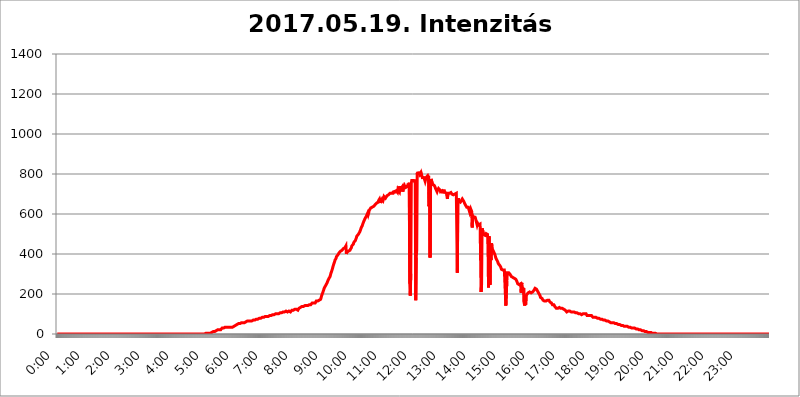
| Category | 2017.05.19. Intenzitás [W/m^2] |
|---|---|
| 0.0 | 0 |
| 0.0006944444444444445 | 0 |
| 0.001388888888888889 | 0 |
| 0.0020833333333333333 | 0 |
| 0.002777777777777778 | 0 |
| 0.003472222222222222 | 0 |
| 0.004166666666666667 | 0 |
| 0.004861111111111111 | 0 |
| 0.005555555555555556 | 0 |
| 0.0062499999999999995 | 0 |
| 0.006944444444444444 | 0 |
| 0.007638888888888889 | 0 |
| 0.008333333333333333 | 0 |
| 0.009027777777777779 | 0 |
| 0.009722222222222222 | 0 |
| 0.010416666666666666 | 0 |
| 0.011111111111111112 | 0 |
| 0.011805555555555555 | 0 |
| 0.012499999999999999 | 0 |
| 0.013194444444444444 | 0 |
| 0.013888888888888888 | 0 |
| 0.014583333333333332 | 0 |
| 0.015277777777777777 | 0 |
| 0.015972222222222224 | 0 |
| 0.016666666666666666 | 0 |
| 0.017361111111111112 | 0 |
| 0.018055555555555557 | 0 |
| 0.01875 | 0 |
| 0.019444444444444445 | 0 |
| 0.02013888888888889 | 0 |
| 0.020833333333333332 | 0 |
| 0.02152777777777778 | 0 |
| 0.022222222222222223 | 0 |
| 0.02291666666666667 | 0 |
| 0.02361111111111111 | 0 |
| 0.024305555555555556 | 0 |
| 0.024999999999999998 | 0 |
| 0.025694444444444447 | 0 |
| 0.02638888888888889 | 0 |
| 0.027083333333333334 | 0 |
| 0.027777777777777776 | 0 |
| 0.02847222222222222 | 0 |
| 0.029166666666666664 | 0 |
| 0.029861111111111113 | 0 |
| 0.030555555555555555 | 0 |
| 0.03125 | 0 |
| 0.03194444444444445 | 0 |
| 0.03263888888888889 | 0 |
| 0.03333333333333333 | 0 |
| 0.034027777777777775 | 0 |
| 0.034722222222222224 | 0 |
| 0.035416666666666666 | 0 |
| 0.036111111111111115 | 0 |
| 0.03680555555555556 | 0 |
| 0.0375 | 0 |
| 0.03819444444444444 | 0 |
| 0.03888888888888889 | 0 |
| 0.03958333333333333 | 0 |
| 0.04027777777777778 | 0 |
| 0.04097222222222222 | 0 |
| 0.041666666666666664 | 0 |
| 0.042361111111111106 | 0 |
| 0.04305555555555556 | 0 |
| 0.043750000000000004 | 0 |
| 0.044444444444444446 | 0 |
| 0.04513888888888889 | 0 |
| 0.04583333333333334 | 0 |
| 0.04652777777777778 | 0 |
| 0.04722222222222222 | 0 |
| 0.04791666666666666 | 0 |
| 0.04861111111111111 | 0 |
| 0.049305555555555554 | 0 |
| 0.049999999999999996 | 0 |
| 0.05069444444444445 | 0 |
| 0.051388888888888894 | 0 |
| 0.052083333333333336 | 0 |
| 0.05277777777777778 | 0 |
| 0.05347222222222222 | 0 |
| 0.05416666666666667 | 0 |
| 0.05486111111111111 | 0 |
| 0.05555555555555555 | 0 |
| 0.05625 | 0 |
| 0.05694444444444444 | 0 |
| 0.057638888888888885 | 0 |
| 0.05833333333333333 | 0 |
| 0.05902777777777778 | 0 |
| 0.059722222222222225 | 0 |
| 0.06041666666666667 | 0 |
| 0.061111111111111116 | 0 |
| 0.06180555555555556 | 0 |
| 0.0625 | 0 |
| 0.06319444444444444 | 0 |
| 0.06388888888888888 | 0 |
| 0.06458333333333334 | 0 |
| 0.06527777777777778 | 0 |
| 0.06597222222222222 | 0 |
| 0.06666666666666667 | 0 |
| 0.06736111111111111 | 0 |
| 0.06805555555555555 | 0 |
| 0.06874999999999999 | 0 |
| 0.06944444444444443 | 0 |
| 0.07013888888888889 | 0 |
| 0.07083333333333333 | 0 |
| 0.07152777777777779 | 0 |
| 0.07222222222222223 | 0 |
| 0.07291666666666667 | 0 |
| 0.07361111111111111 | 0 |
| 0.07430555555555556 | 0 |
| 0.075 | 0 |
| 0.07569444444444444 | 0 |
| 0.0763888888888889 | 0 |
| 0.07708333333333334 | 0 |
| 0.07777777777777778 | 0 |
| 0.07847222222222222 | 0 |
| 0.07916666666666666 | 0 |
| 0.0798611111111111 | 0 |
| 0.08055555555555556 | 0 |
| 0.08125 | 0 |
| 0.08194444444444444 | 0 |
| 0.08263888888888889 | 0 |
| 0.08333333333333333 | 0 |
| 0.08402777777777777 | 0 |
| 0.08472222222222221 | 0 |
| 0.08541666666666665 | 0 |
| 0.08611111111111112 | 0 |
| 0.08680555555555557 | 0 |
| 0.08750000000000001 | 0 |
| 0.08819444444444445 | 0 |
| 0.08888888888888889 | 0 |
| 0.08958333333333333 | 0 |
| 0.09027777777777778 | 0 |
| 0.09097222222222222 | 0 |
| 0.09166666666666667 | 0 |
| 0.09236111111111112 | 0 |
| 0.09305555555555556 | 0 |
| 0.09375 | 0 |
| 0.09444444444444444 | 0 |
| 0.09513888888888888 | 0 |
| 0.09583333333333333 | 0 |
| 0.09652777777777777 | 0 |
| 0.09722222222222222 | 0 |
| 0.09791666666666667 | 0 |
| 0.09861111111111111 | 0 |
| 0.09930555555555555 | 0 |
| 0.09999999999999999 | 0 |
| 0.10069444444444443 | 0 |
| 0.1013888888888889 | 0 |
| 0.10208333333333335 | 0 |
| 0.10277777777777779 | 0 |
| 0.10347222222222223 | 0 |
| 0.10416666666666667 | 0 |
| 0.10486111111111111 | 0 |
| 0.10555555555555556 | 0 |
| 0.10625 | 0 |
| 0.10694444444444444 | 0 |
| 0.1076388888888889 | 0 |
| 0.10833333333333334 | 0 |
| 0.10902777777777778 | 0 |
| 0.10972222222222222 | 0 |
| 0.1111111111111111 | 0 |
| 0.11180555555555556 | 0 |
| 0.11180555555555556 | 0 |
| 0.1125 | 0 |
| 0.11319444444444444 | 0 |
| 0.11388888888888889 | 0 |
| 0.11458333333333333 | 0 |
| 0.11527777777777777 | 0 |
| 0.11597222222222221 | 0 |
| 0.11666666666666665 | 0 |
| 0.1173611111111111 | 0 |
| 0.11805555555555557 | 0 |
| 0.11944444444444445 | 0 |
| 0.12013888888888889 | 0 |
| 0.12083333333333333 | 0 |
| 0.12152777777777778 | 0 |
| 0.12222222222222223 | 0 |
| 0.12291666666666667 | 0 |
| 0.12291666666666667 | 0 |
| 0.12361111111111112 | 0 |
| 0.12430555555555556 | 0 |
| 0.125 | 0 |
| 0.12569444444444444 | 0 |
| 0.12638888888888888 | 0 |
| 0.12708333333333333 | 0 |
| 0.16875 | 0 |
| 0.12847222222222224 | 0 |
| 0.12916666666666668 | 0 |
| 0.12986111111111112 | 0 |
| 0.13055555555555556 | 0 |
| 0.13125 | 0 |
| 0.13194444444444445 | 0 |
| 0.1326388888888889 | 0 |
| 0.13333333333333333 | 0 |
| 0.13402777777777777 | 0 |
| 0.13402777777777777 | 0 |
| 0.13472222222222222 | 0 |
| 0.13541666666666666 | 0 |
| 0.1361111111111111 | 0 |
| 0.13749999999999998 | 0 |
| 0.13819444444444443 | 0 |
| 0.1388888888888889 | 0 |
| 0.13958333333333334 | 0 |
| 0.14027777777777778 | 0 |
| 0.14097222222222222 | 0 |
| 0.14166666666666666 | 0 |
| 0.1423611111111111 | 0 |
| 0.14305555555555557 | 0 |
| 0.14375000000000002 | 0 |
| 0.14444444444444446 | 0 |
| 0.1451388888888889 | 0 |
| 0.1451388888888889 | 0 |
| 0.14652777777777778 | 0 |
| 0.14722222222222223 | 0 |
| 0.14791666666666667 | 0 |
| 0.1486111111111111 | 0 |
| 0.14930555555555555 | 0 |
| 0.15 | 0 |
| 0.15069444444444444 | 0 |
| 0.15138888888888888 | 0 |
| 0.15208333333333332 | 0 |
| 0.15277777777777776 | 0 |
| 0.15347222222222223 | 0 |
| 0.15416666666666667 | 0 |
| 0.15486111111111112 | 0 |
| 0.15555555555555556 | 0 |
| 0.15625 | 0 |
| 0.15694444444444444 | 0 |
| 0.15763888888888888 | 0 |
| 0.15833333333333333 | 0 |
| 0.15902777777777777 | 0 |
| 0.15972222222222224 | 0 |
| 0.16041666666666668 | 0 |
| 0.16111111111111112 | 0 |
| 0.16180555555555556 | 0 |
| 0.1625 | 0 |
| 0.16319444444444445 | 0 |
| 0.1638888888888889 | 0 |
| 0.16458333333333333 | 0 |
| 0.16527777777777777 | 0 |
| 0.16597222222222222 | 0 |
| 0.16666666666666666 | 0 |
| 0.1673611111111111 | 0 |
| 0.16805555555555554 | 0 |
| 0.16874999999999998 | 0 |
| 0.16944444444444443 | 0 |
| 0.17013888888888887 | 0 |
| 0.1708333333333333 | 0 |
| 0.17152777777777775 | 0 |
| 0.17222222222222225 | 0 |
| 0.1729166666666667 | 0 |
| 0.17361111111111113 | 0 |
| 0.17430555555555557 | 0 |
| 0.17500000000000002 | 0 |
| 0.17569444444444446 | 0 |
| 0.1763888888888889 | 0 |
| 0.17708333333333334 | 0 |
| 0.17777777777777778 | 0 |
| 0.17847222222222223 | 0 |
| 0.17916666666666667 | 0 |
| 0.1798611111111111 | 0 |
| 0.18055555555555555 | 0 |
| 0.18125 | 0 |
| 0.18194444444444444 | 0 |
| 0.1826388888888889 | 0 |
| 0.18333333333333335 | 0 |
| 0.1840277777777778 | 0 |
| 0.18472222222222223 | 0 |
| 0.18541666666666667 | 0 |
| 0.18611111111111112 | 0 |
| 0.18680555555555556 | 0 |
| 0.1875 | 0 |
| 0.18819444444444444 | 0 |
| 0.18888888888888888 | 0 |
| 0.18958333333333333 | 0 |
| 0.19027777777777777 | 0 |
| 0.1909722222222222 | 0 |
| 0.19166666666666665 | 0 |
| 0.19236111111111112 | 0 |
| 0.19305555555555554 | 0 |
| 0.19375 | 0 |
| 0.19444444444444445 | 0 |
| 0.1951388888888889 | 0 |
| 0.19583333333333333 | 0 |
| 0.19652777777777777 | 0 |
| 0.19722222222222222 | 0 |
| 0.19791666666666666 | 0 |
| 0.1986111111111111 | 0 |
| 0.19930555555555554 | 0 |
| 0.19999999999999998 | 0 |
| 0.20069444444444443 | 0 |
| 0.20138888888888887 | 0 |
| 0.2020833333333333 | 0 |
| 0.2027777777777778 | 0 |
| 0.2034722222222222 | 0 |
| 0.2041666666666667 | 0 |
| 0.20486111111111113 | 0 |
| 0.20555555555555557 | 0 |
| 0.20625000000000002 | 0 |
| 0.20694444444444446 | 0 |
| 0.2076388888888889 | 0 |
| 0.20833333333333334 | 3.525 |
| 0.20902777777777778 | 3.525 |
| 0.20972222222222223 | 3.525 |
| 0.21041666666666667 | 3.525 |
| 0.2111111111111111 | 3.525 |
| 0.21180555555555555 | 3.525 |
| 0.2125 | 3.525 |
| 0.21319444444444444 | 3.525 |
| 0.2138888888888889 | 3.525 |
| 0.21458333333333335 | 3.525 |
| 0.2152777777777778 | 7.887 |
| 0.21597222222222223 | 7.887 |
| 0.21666666666666667 | 7.887 |
| 0.21736111111111112 | 12.257 |
| 0.21805555555555556 | 12.257 |
| 0.21875 | 12.257 |
| 0.21944444444444444 | 12.257 |
| 0.22013888888888888 | 12.257 |
| 0.22083333333333333 | 12.257 |
| 0.22152777777777777 | 16.636 |
| 0.2222222222222222 | 16.636 |
| 0.22291666666666665 | 16.636 |
| 0.2236111111111111 | 16.636 |
| 0.22430555555555556 | 16.636 |
| 0.225 | 21.024 |
| 0.22569444444444445 | 21.024 |
| 0.2263888888888889 | 21.024 |
| 0.22708333333333333 | 21.024 |
| 0.22777777777777777 | 21.024 |
| 0.22847222222222222 | 21.024 |
| 0.22916666666666666 | 21.024 |
| 0.2298611111111111 | 25.419 |
| 0.23055555555555554 | 25.419 |
| 0.23124999999999998 | 29.823 |
| 0.23194444444444443 | 29.823 |
| 0.23263888888888887 | 29.823 |
| 0.2333333333333333 | 29.823 |
| 0.2340277777777778 | 34.234 |
| 0.2347222222222222 | 34.234 |
| 0.2354166666666667 | 34.234 |
| 0.23611111111111113 | 34.234 |
| 0.23680555555555557 | 34.234 |
| 0.23750000000000002 | 34.234 |
| 0.23819444444444446 | 34.234 |
| 0.2388888888888889 | 34.234 |
| 0.23958333333333334 | 34.234 |
| 0.24027777777777778 | 34.234 |
| 0.24097222222222223 | 34.234 |
| 0.24166666666666667 | 34.234 |
| 0.2423611111111111 | 34.234 |
| 0.24305555555555555 | 34.234 |
| 0.24375 | 34.234 |
| 0.24444444444444446 | 34.234 |
| 0.24513888888888888 | 34.234 |
| 0.24583333333333335 | 34.234 |
| 0.2465277777777778 | 38.653 |
| 0.24722222222222223 | 38.653 |
| 0.24791666666666667 | 38.653 |
| 0.24861111111111112 | 43.079 |
| 0.24930555555555556 | 43.079 |
| 0.25 | 43.079 |
| 0.25069444444444444 | 47.511 |
| 0.2513888888888889 | 47.511 |
| 0.2520833333333333 | 47.511 |
| 0.25277777777777777 | 47.511 |
| 0.2534722222222222 | 47.511 |
| 0.25416666666666665 | 51.951 |
| 0.2548611111111111 | 51.951 |
| 0.2555555555555556 | 51.951 |
| 0.25625000000000003 | 51.951 |
| 0.2569444444444445 | 51.951 |
| 0.2576388888888889 | 51.951 |
| 0.25833333333333336 | 56.398 |
| 0.2590277777777778 | 56.398 |
| 0.25972222222222224 | 56.398 |
| 0.2604166666666667 | 56.398 |
| 0.2611111111111111 | 56.398 |
| 0.26180555555555557 | 56.398 |
| 0.2625 | 56.398 |
| 0.26319444444444445 | 60.85 |
| 0.2638888888888889 | 60.85 |
| 0.26458333333333334 | 60.85 |
| 0.2652777777777778 | 60.85 |
| 0.2659722222222222 | 60.85 |
| 0.26666666666666666 | 65.31 |
| 0.2673611111111111 | 60.85 |
| 0.26805555555555555 | 65.31 |
| 0.26875 | 65.31 |
| 0.26944444444444443 | 65.31 |
| 0.2701388888888889 | 65.31 |
| 0.2708333333333333 | 65.31 |
| 0.27152777777777776 | 65.31 |
| 0.2722222222222222 | 65.31 |
| 0.27291666666666664 | 65.31 |
| 0.2736111111111111 | 65.31 |
| 0.2743055555555555 | 69.775 |
| 0.27499999999999997 | 69.775 |
| 0.27569444444444446 | 69.775 |
| 0.27638888888888885 | 69.775 |
| 0.27708333333333335 | 69.775 |
| 0.2777777777777778 | 69.775 |
| 0.27847222222222223 | 69.775 |
| 0.2791666666666667 | 74.246 |
| 0.2798611111111111 | 74.246 |
| 0.28055555555555556 | 74.246 |
| 0.28125 | 74.246 |
| 0.28194444444444444 | 74.246 |
| 0.2826388888888889 | 78.722 |
| 0.2833333333333333 | 78.722 |
| 0.28402777777777777 | 78.722 |
| 0.2847222222222222 | 78.722 |
| 0.28541666666666665 | 78.722 |
| 0.28611111111111115 | 78.722 |
| 0.28680555555555554 | 78.722 |
| 0.28750000000000003 | 83.205 |
| 0.2881944444444445 | 83.205 |
| 0.2888888888888889 | 83.205 |
| 0.28958333333333336 | 83.205 |
| 0.2902777777777778 | 83.205 |
| 0.29097222222222224 | 83.205 |
| 0.2916666666666667 | 87.692 |
| 0.2923611111111111 | 87.692 |
| 0.29305555555555557 | 87.692 |
| 0.29375 | 87.692 |
| 0.29444444444444445 | 87.692 |
| 0.2951388888888889 | 87.692 |
| 0.29583333333333334 | 87.692 |
| 0.2965277777777778 | 92.184 |
| 0.2972222222222222 | 87.692 |
| 0.29791666666666666 | 92.184 |
| 0.2986111111111111 | 92.184 |
| 0.29930555555555555 | 92.184 |
| 0.3 | 92.184 |
| 0.30069444444444443 | 92.184 |
| 0.3013888888888889 | 92.184 |
| 0.3020833333333333 | 96.682 |
| 0.30277777777777776 | 96.682 |
| 0.3034722222222222 | 96.682 |
| 0.30416666666666664 | 96.682 |
| 0.3048611111111111 | 96.682 |
| 0.3055555555555555 | 101.184 |
| 0.30624999999999997 | 101.184 |
| 0.3069444444444444 | 101.184 |
| 0.3076388888888889 | 101.184 |
| 0.30833333333333335 | 101.184 |
| 0.3090277777777778 | 101.184 |
| 0.30972222222222223 | 101.184 |
| 0.3104166666666667 | 101.184 |
| 0.3111111111111111 | 101.184 |
| 0.31180555555555556 | 105.69 |
| 0.3125 | 105.69 |
| 0.31319444444444444 | 101.184 |
| 0.3138888888888889 | 101.184 |
| 0.3145833333333333 | 105.69 |
| 0.31527777777777777 | 110.201 |
| 0.3159722222222222 | 110.201 |
| 0.31666666666666665 | 110.201 |
| 0.31736111111111115 | 110.201 |
| 0.31805555555555554 | 110.201 |
| 0.31875000000000003 | 110.201 |
| 0.3194444444444445 | 110.201 |
| 0.3201388888888889 | 110.201 |
| 0.32083333333333336 | 114.716 |
| 0.3215277777777778 | 119.235 |
| 0.32222222222222224 | 110.201 |
| 0.3229166666666667 | 110.201 |
| 0.3236111111111111 | 114.716 |
| 0.32430555555555557 | 114.716 |
| 0.325 | 114.716 |
| 0.32569444444444445 | 114.716 |
| 0.3263888888888889 | 110.201 |
| 0.32708333333333334 | 110.201 |
| 0.3277777777777778 | 114.716 |
| 0.3284722222222222 | 114.716 |
| 0.32916666666666666 | 119.235 |
| 0.3298611111111111 | 119.235 |
| 0.33055555555555555 | 119.235 |
| 0.33125 | 119.235 |
| 0.33194444444444443 | 119.235 |
| 0.3326388888888889 | 123.758 |
| 0.3333333333333333 | 123.758 |
| 0.3340277777777778 | 123.758 |
| 0.3347222222222222 | 128.284 |
| 0.3354166666666667 | 123.758 |
| 0.3361111111111111 | 128.284 |
| 0.3368055555555556 | 128.284 |
| 0.33749999999999997 | 119.235 |
| 0.33819444444444446 | 123.758 |
| 0.33888888888888885 | 128.284 |
| 0.33958333333333335 | 128.284 |
| 0.34027777777777773 | 132.814 |
| 0.34097222222222223 | 132.814 |
| 0.3416666666666666 | 132.814 |
| 0.3423611111111111 | 137.347 |
| 0.3430555555555555 | 137.347 |
| 0.34375 | 137.347 |
| 0.3444444444444445 | 137.347 |
| 0.3451388888888889 | 137.347 |
| 0.3458333333333334 | 137.347 |
| 0.34652777777777777 | 137.347 |
| 0.34722222222222227 | 141.884 |
| 0.34791666666666665 | 141.884 |
| 0.34861111111111115 | 141.884 |
| 0.34930555555555554 | 141.884 |
| 0.35000000000000003 | 146.423 |
| 0.3506944444444444 | 146.423 |
| 0.3513888888888889 | 141.884 |
| 0.3520833333333333 | 141.884 |
| 0.3527777777777778 | 146.423 |
| 0.3534722222222222 | 146.423 |
| 0.3541666666666667 | 146.423 |
| 0.3548611111111111 | 146.423 |
| 0.35555555555555557 | 146.423 |
| 0.35625 | 150.964 |
| 0.35694444444444445 | 150.964 |
| 0.3576388888888889 | 155.509 |
| 0.35833333333333334 | 155.509 |
| 0.3590277777777778 | 155.509 |
| 0.3597222222222222 | 155.509 |
| 0.36041666666666666 | 160.056 |
| 0.3611111111111111 | 155.509 |
| 0.36180555555555555 | 155.509 |
| 0.3625 | 160.056 |
| 0.36319444444444443 | 164.605 |
| 0.3638888888888889 | 164.605 |
| 0.3645833333333333 | 164.605 |
| 0.3652777777777778 | 164.605 |
| 0.3659722222222222 | 164.605 |
| 0.3666666666666667 | 164.605 |
| 0.3673611111111111 | 169.156 |
| 0.3680555555555556 | 169.156 |
| 0.36874999999999997 | 173.709 |
| 0.36944444444444446 | 173.709 |
| 0.37013888888888885 | 182.82 |
| 0.37083333333333335 | 191.937 |
| 0.37152777777777773 | 196.497 |
| 0.37222222222222223 | 205.62 |
| 0.3729166666666666 | 210.182 |
| 0.3736111111111111 | 219.309 |
| 0.3743055555555555 | 228.436 |
| 0.375 | 233 |
| 0.3756944444444445 | 237.564 |
| 0.3763888888888889 | 242.127 |
| 0.3770833333333334 | 246.689 |
| 0.37777777777777777 | 251.251 |
| 0.37847222222222227 | 255.813 |
| 0.37916666666666665 | 260.373 |
| 0.37986111111111115 | 269.49 |
| 0.38055555555555554 | 274.047 |
| 0.38125000000000003 | 278.603 |
| 0.3819444444444444 | 283.156 |
| 0.3826388888888889 | 287.709 |
| 0.3833333333333333 | 292.259 |
| 0.3840277777777778 | 305.898 |
| 0.3847222222222222 | 310.44 |
| 0.3854166666666667 | 319.517 |
| 0.3861111111111111 | 328.584 |
| 0.38680555555555557 | 337.639 |
| 0.3875 | 346.682 |
| 0.38819444444444445 | 351.198 |
| 0.3888888888888889 | 360.221 |
| 0.38958333333333334 | 369.23 |
| 0.3902777777777778 | 373.729 |
| 0.3909722222222222 | 378.224 |
| 0.39166666666666666 | 387.202 |
| 0.3923611111111111 | 382.715 |
| 0.39305555555555555 | 387.202 |
| 0.39375 | 396.164 |
| 0.39444444444444443 | 400.638 |
| 0.3951388888888889 | 405.108 |
| 0.3958333333333333 | 405.108 |
| 0.3965277777777778 | 409.574 |
| 0.3972222222222222 | 414.035 |
| 0.3979166666666667 | 414.035 |
| 0.3986111111111111 | 418.492 |
| 0.3993055555555556 | 418.492 |
| 0.39999999999999997 | 422.943 |
| 0.40069444444444446 | 422.943 |
| 0.40138888888888885 | 427.39 |
| 0.40208333333333335 | 431.833 |
| 0.40277777777777773 | 431.833 |
| 0.40347222222222223 | 431.833 |
| 0.4041666666666666 | 431.833 |
| 0.4048611111111111 | 440.702 |
| 0.4055555555555555 | 400.638 |
| 0.40625 | 409.574 |
| 0.4069444444444445 | 405.108 |
| 0.4076388888888889 | 409.574 |
| 0.4083333333333334 | 414.035 |
| 0.40902777777777777 | 414.035 |
| 0.40972222222222227 | 418.492 |
| 0.41041666666666665 | 418.492 |
| 0.41111111111111115 | 418.492 |
| 0.41180555555555554 | 422.943 |
| 0.41250000000000003 | 431.833 |
| 0.4131944444444444 | 440.702 |
| 0.4138888888888889 | 440.702 |
| 0.4145833333333333 | 445.129 |
| 0.4152777777777778 | 449.551 |
| 0.4159722222222222 | 458.38 |
| 0.4166666666666667 | 462.786 |
| 0.4173611111111111 | 462.786 |
| 0.41805555555555557 | 467.187 |
| 0.41875 | 471.582 |
| 0.41944444444444445 | 480.356 |
| 0.4201388888888889 | 489.108 |
| 0.42083333333333334 | 493.475 |
| 0.4215277777777778 | 493.475 |
| 0.4222222222222222 | 497.836 |
| 0.42291666666666666 | 497.836 |
| 0.4236111111111111 | 502.192 |
| 0.42430555555555555 | 510.885 |
| 0.425 | 515.223 |
| 0.42569444444444443 | 523.88 |
| 0.4263888888888889 | 532.513 |
| 0.4270833333333333 | 532.513 |
| 0.4277777777777778 | 541.121 |
| 0.4284722222222222 | 549.704 |
| 0.4291666666666667 | 553.986 |
| 0.4298611111111111 | 562.53 |
| 0.4305555555555556 | 566.793 |
| 0.43124999999999997 | 566.793 |
| 0.43194444444444446 | 579.542 |
| 0.43263888888888885 | 583.779 |
| 0.43333333333333335 | 588.009 |
| 0.43402777777777773 | 592.233 |
| 0.43472222222222223 | 588.009 |
| 0.4354166666666666 | 604.864 |
| 0.4361111111111111 | 596.45 |
| 0.4368055555555555 | 604.864 |
| 0.4375 | 617.436 |
| 0.4381944444444445 | 621.613 |
| 0.4388888888888889 | 617.436 |
| 0.4395833333333334 | 629.948 |
| 0.44027777777777777 | 634.105 |
| 0.44097222222222227 | 634.105 |
| 0.44166666666666665 | 634.105 |
| 0.44236111111111115 | 634.105 |
| 0.44305555555555554 | 638.256 |
| 0.44375000000000003 | 638.256 |
| 0.4444444444444444 | 642.4 |
| 0.4451388888888889 | 634.105 |
| 0.4458333333333333 | 646.537 |
| 0.4465277777777778 | 646.537 |
| 0.4472222222222222 | 650.667 |
| 0.4479166666666667 | 654.791 |
| 0.4486111111111111 | 658.909 |
| 0.44930555555555557 | 654.791 |
| 0.45 | 658.909 |
| 0.45069444444444445 | 667.123 |
| 0.4513888888888889 | 671.22 |
| 0.45208333333333334 | 675.311 |
| 0.4527777777777778 | 667.123 |
| 0.4534722222222222 | 654.791 |
| 0.45416666666666666 | 667.123 |
| 0.4548611111111111 | 671.22 |
| 0.45555555555555555 | 675.311 |
| 0.45625 | 679.395 |
| 0.45694444444444443 | 667.123 |
| 0.4576388888888889 | 675.311 |
| 0.4583333333333333 | 687.544 |
| 0.4590277777777778 | 687.544 |
| 0.4597222222222222 | 683.473 |
| 0.4604166666666667 | 679.395 |
| 0.4611111111111111 | 683.473 |
| 0.4618055555555556 | 679.395 |
| 0.46249999999999997 | 691.608 |
| 0.46319444444444446 | 691.608 |
| 0.46388888888888885 | 691.608 |
| 0.46458333333333335 | 695.666 |
| 0.46527777777777773 | 695.666 |
| 0.46597222222222223 | 699.717 |
| 0.4666666666666666 | 703.762 |
| 0.4673611111111111 | 699.717 |
| 0.4680555555555555 | 699.717 |
| 0.46875 | 703.762 |
| 0.4694444444444445 | 699.717 |
| 0.4701388888888889 | 703.762 |
| 0.4708333333333334 | 703.762 |
| 0.47152777777777777 | 715.858 |
| 0.47222222222222227 | 703.762 |
| 0.47291666666666665 | 711.832 |
| 0.47361111111111115 | 711.832 |
| 0.47430555555555554 | 711.832 |
| 0.47500000000000003 | 715.858 |
| 0.4756944444444444 | 719.877 |
| 0.4763888888888889 | 711.832 |
| 0.4770833333333333 | 707.8 |
| 0.4777777777777778 | 723.889 |
| 0.4784722222222222 | 719.877 |
| 0.4791666666666667 | 723.889 |
| 0.4798611111111111 | 711.832 |
| 0.48055555555555557 | 739.877 |
| 0.48125 | 719.877 |
| 0.48194444444444445 | 723.889 |
| 0.4826388888888889 | 727.896 |
| 0.48333333333333334 | 731.896 |
| 0.4840277777777778 | 735.89 |
| 0.4847222222222222 | 711.832 |
| 0.48541666666666666 | 735.89 |
| 0.4861111111111111 | 739.877 |
| 0.48680555555555555 | 743.859 |
| 0.4875 | 739.877 |
| 0.48819444444444443 | 731.896 |
| 0.4888888888888889 | 727.896 |
| 0.4895833333333333 | 735.89 |
| 0.4902777777777778 | 735.89 |
| 0.4909722222222222 | 731.896 |
| 0.4916666666666667 | 743.859 |
| 0.4923611111111111 | 751.803 |
| 0.4930555555555556 | 731.896 |
| 0.49374999999999997 | 755.766 |
| 0.49444444444444446 | 251.251 |
| 0.49513888888888885 | 191.937 |
| 0.49583333333333335 | 301.354 |
| 0.49652777777777773 | 751.803 |
| 0.49722222222222223 | 767.62 |
| 0.4979166666666666 | 763.674 |
| 0.4986111111111111 | 763.674 |
| 0.4993055555555555 | 767.62 |
| 0.5 | 759.723 |
| 0.5006944444444444 | 771.559 |
| 0.5013888888888889 | 775.492 |
| 0.5020833333333333 | 755.766 |
| 0.5027777777777778 | 169.156 |
| 0.5034722222222222 | 382.715 |
| 0.5041666666666667 | 418.492 |
| 0.5048611111111111 | 806.757 |
| 0.5055555555555555 | 798.974 |
| 0.50625 | 810.641 |
| 0.5069444444444444 | 795.074 |
| 0.5076388888888889 | 810.641 |
| 0.5083333333333333 | 798.974 |
| 0.5090277777777777 | 802.868 |
| 0.5097222222222222 | 806.757 |
| 0.5104166666666666 | 787.258 |
| 0.5111111111111112 | 795.074 |
| 0.5118055555555555 | 791.169 |
| 0.5125000000000001 | 775.492 |
| 0.5131944444444444 | 787.258 |
| 0.513888888888889 | 775.492 |
| 0.5145833333333333 | 783.342 |
| 0.5152777777777778 | 771.559 |
| 0.5159722222222222 | 763.674 |
| 0.5166666666666667 | 767.62 |
| 0.517361111111111 | 783.342 |
| 0.5180555555555556 | 779.42 |
| 0.5187499999999999 | 779.42 |
| 0.5194444444444445 | 791.169 |
| 0.5201388888888888 | 783.342 |
| 0.5208333333333334 | 791.169 |
| 0.5215277777777778 | 638.256 |
| 0.5222222222222223 | 763.674 |
| 0.5229166666666667 | 382.715 |
| 0.5236111111111111 | 759.723 |
| 0.5243055555555556 | 775.492 |
| 0.525 | 775.492 |
| 0.5256944444444445 | 771.559 |
| 0.5263888888888889 | 747.834 |
| 0.5270833333333333 | 747.834 |
| 0.5277777777777778 | 747.834 |
| 0.5284722222222222 | 743.859 |
| 0.5291666666666667 | 743.859 |
| 0.5298611111111111 | 735.89 |
| 0.5305555555555556 | 727.896 |
| 0.53125 | 727.896 |
| 0.5319444444444444 | 723.889 |
| 0.5326388888888889 | 711.832 |
| 0.5333333333333333 | 719.877 |
| 0.5340277777777778 | 723.889 |
| 0.5347222222222222 | 727.896 |
| 0.5354166666666667 | 727.896 |
| 0.5361111111111111 | 723.889 |
| 0.5368055555555555 | 719.877 |
| 0.5375 | 711.832 |
| 0.5381944444444444 | 707.8 |
| 0.5388888888888889 | 715.858 |
| 0.5395833333333333 | 715.858 |
| 0.5402777777777777 | 703.762 |
| 0.5409722222222222 | 715.858 |
| 0.5416666666666666 | 719.877 |
| 0.5423611111111112 | 719.877 |
| 0.5430555555555555 | 715.858 |
| 0.5437500000000001 | 707.8 |
| 0.5444444444444444 | 711.832 |
| 0.545138888888889 | 711.832 |
| 0.5458333333333333 | 703.762 |
| 0.5465277777777778 | 699.717 |
| 0.5472222222222222 | 675.311 |
| 0.5479166666666667 | 703.762 |
| 0.548611111111111 | 707.8 |
| 0.5493055555555556 | 707.8 |
| 0.5499999999999999 | 703.762 |
| 0.5506944444444445 | 703.762 |
| 0.5513888888888888 | 703.762 |
| 0.5520833333333334 | 707.8 |
| 0.5527777777777778 | 707.8 |
| 0.5534722222222223 | 699.717 |
| 0.5541666666666667 | 699.717 |
| 0.5548611111111111 | 699.717 |
| 0.5555555555555556 | 695.666 |
| 0.55625 | 699.717 |
| 0.5569444444444445 | 699.717 |
| 0.5576388888888889 | 699.717 |
| 0.5583333333333333 | 699.717 |
| 0.5590277777777778 | 703.762 |
| 0.5597222222222222 | 703.762 |
| 0.5604166666666667 | 699.717 |
| 0.5611111111111111 | 305.898 |
| 0.5618055555555556 | 667.123 |
| 0.5625 | 679.395 |
| 0.5631944444444444 | 663.019 |
| 0.5638888888888889 | 658.909 |
| 0.5645833333333333 | 658.909 |
| 0.5652777777777778 | 658.909 |
| 0.5659722222222222 | 658.909 |
| 0.5666666666666667 | 667.123 |
| 0.5673611111111111 | 671.22 |
| 0.5680555555555555 | 675.311 |
| 0.56875 | 679.395 |
| 0.5694444444444444 | 675.311 |
| 0.5701388888888889 | 663.019 |
| 0.5708333333333333 | 658.909 |
| 0.5715277777777777 | 663.019 |
| 0.5722222222222222 | 646.537 |
| 0.5729166666666666 | 642.4 |
| 0.5736111111111112 | 642.4 |
| 0.5743055555555555 | 634.105 |
| 0.5750000000000001 | 634.105 |
| 0.5756944444444444 | 629.948 |
| 0.576388888888889 | 634.105 |
| 0.5770833333333333 | 625.784 |
| 0.5777777777777778 | 621.613 |
| 0.5784722222222222 | 609.062 |
| 0.5791666666666667 | 617.436 |
| 0.579861111111111 | 625.784 |
| 0.5805555555555556 | 621.613 |
| 0.5812499999999999 | 613.252 |
| 0.5819444444444445 | 532.513 |
| 0.5826388888888888 | 592.233 |
| 0.5833333333333334 | 588.009 |
| 0.5840277777777778 | 583.779 |
| 0.5847222222222223 | 583.779 |
| 0.5854166666666667 | 583.779 |
| 0.5861111111111111 | 583.779 |
| 0.5868055555555556 | 575.299 |
| 0.5875 | 571.049 |
| 0.5881944444444445 | 575.299 |
| 0.5888888888888889 | 545.416 |
| 0.5895833333333333 | 553.986 |
| 0.5902777777777778 | 549.704 |
| 0.5909722222222222 | 545.416 |
| 0.5916666666666667 | 545.416 |
| 0.5923611111111111 | 549.704 |
| 0.5930555555555556 | 549.704 |
| 0.59375 | 549.704 |
| 0.5944444444444444 | 210.182 |
| 0.5951388888888889 | 246.689 |
| 0.5958333333333333 | 528.2 |
| 0.5965277777777778 | 523.88 |
| 0.5972222222222222 | 510.885 |
| 0.5979166666666667 | 497.836 |
| 0.5986111111111111 | 497.836 |
| 0.5993055555555555 | 493.475 |
| 0.6 | 493.475 |
| 0.6006944444444444 | 497.836 |
| 0.6013888888888889 | 502.192 |
| 0.6020833333333333 | 497.836 |
| 0.6027777777777777 | 502.192 |
| 0.6034722222222222 | 497.836 |
| 0.6041666666666666 | 431.833 |
| 0.6048611111111112 | 233 |
| 0.6055555555555555 | 489.108 |
| 0.6062500000000001 | 484.735 |
| 0.6069444444444444 | 246.689 |
| 0.607638888888889 | 427.39 |
| 0.6083333333333333 | 369.23 |
| 0.6090277777777778 | 453.968 |
| 0.6097222222222222 | 440.702 |
| 0.6104166666666667 | 422.943 |
| 0.611111111111111 | 418.492 |
| 0.6118055555555556 | 414.035 |
| 0.6124999999999999 | 409.574 |
| 0.6131944444444445 | 409.574 |
| 0.6138888888888888 | 396.164 |
| 0.6145833333333334 | 387.202 |
| 0.6152777777777778 | 378.224 |
| 0.6159722222222223 | 378.224 |
| 0.6166666666666667 | 373.729 |
| 0.6173611111111111 | 364.728 |
| 0.6180555555555556 | 360.221 |
| 0.61875 | 351.198 |
| 0.6194444444444445 | 351.198 |
| 0.6201388888888889 | 346.682 |
| 0.6208333333333333 | 342.162 |
| 0.6215277777777778 | 342.162 |
| 0.6222222222222222 | 333.113 |
| 0.6229166666666667 | 324.052 |
| 0.6236111111111111 | 324.052 |
| 0.6243055555555556 | 319.517 |
| 0.625 | 319.517 |
| 0.6256944444444444 | 314.98 |
| 0.6263888888888889 | 319.517 |
| 0.6270833333333333 | 319.517 |
| 0.6277777777777778 | 314.98 |
| 0.6284722222222222 | 314.98 |
| 0.6291666666666667 | 141.884 |
| 0.6298611111111111 | 137.347 |
| 0.6305555555555555 | 264.932 |
| 0.63125 | 305.898 |
| 0.6319444444444444 | 305.898 |
| 0.6326388888888889 | 305.898 |
| 0.6333333333333333 | 305.898 |
| 0.6340277777777777 | 301.354 |
| 0.6347222222222222 | 301.354 |
| 0.6354166666666666 | 296.808 |
| 0.6361111111111112 | 292.259 |
| 0.6368055555555555 | 287.709 |
| 0.6375000000000001 | 283.156 |
| 0.6381944444444444 | 283.156 |
| 0.638888888888889 | 283.156 |
| 0.6395833333333333 | 283.156 |
| 0.6402777777777778 | 283.156 |
| 0.6409722222222222 | 278.603 |
| 0.6416666666666667 | 278.603 |
| 0.642361111111111 | 278.603 |
| 0.6430555555555556 | 274.047 |
| 0.6437499999999999 | 269.49 |
| 0.6444444444444445 | 264.932 |
| 0.6451388888888888 | 260.373 |
| 0.6458333333333334 | 251.251 |
| 0.6465277777777778 | 251.251 |
| 0.6472222222222223 | 251.251 |
| 0.6479166666666667 | 246.689 |
| 0.6486111111111111 | 246.689 |
| 0.6493055555555556 | 246.689 |
| 0.65 | 251.251 |
| 0.6506944444444445 | 205.62 |
| 0.6513888888888889 | 255.813 |
| 0.6520833333333333 | 219.309 |
| 0.6527777777777778 | 233 |
| 0.6534722222222222 | 210.182 |
| 0.6541666666666667 | 228.436 |
| 0.6548611111111111 | 155.509 |
| 0.6555555555555556 | 141.884 |
| 0.65625 | 164.605 |
| 0.6569444444444444 | 146.423 |
| 0.6576388888888889 | 187.378 |
| 0.6583333333333333 | 196.497 |
| 0.6590277777777778 | 196.497 |
| 0.6597222222222222 | 201.058 |
| 0.6604166666666667 | 205.62 |
| 0.6611111111111111 | 210.182 |
| 0.6618055555555555 | 210.182 |
| 0.6625 | 210.182 |
| 0.6631944444444444 | 210.182 |
| 0.6638888888888889 | 205.62 |
| 0.6645833333333333 | 205.62 |
| 0.6652777777777777 | 205.62 |
| 0.6659722222222222 | 210.182 |
| 0.6666666666666666 | 210.182 |
| 0.6673611111111111 | 214.746 |
| 0.6680555555555556 | 214.746 |
| 0.6687500000000001 | 219.309 |
| 0.6694444444444444 | 223.873 |
| 0.6701388888888888 | 228.436 |
| 0.6708333333333334 | 228.436 |
| 0.6715277777777778 | 228.436 |
| 0.6722222222222222 | 223.873 |
| 0.6729166666666666 | 219.309 |
| 0.6736111111111112 | 214.746 |
| 0.6743055555555556 | 210.182 |
| 0.6749999999999999 | 205.62 |
| 0.6756944444444444 | 205.62 |
| 0.6763888888888889 | 201.058 |
| 0.6770833333333334 | 191.937 |
| 0.6777777777777777 | 182.82 |
| 0.6784722222222223 | 182.82 |
| 0.6791666666666667 | 182.82 |
| 0.6798611111111111 | 178.264 |
| 0.6805555555555555 | 173.709 |
| 0.68125 | 169.156 |
| 0.6819444444444445 | 164.605 |
| 0.6826388888888889 | 164.605 |
| 0.6833333333333332 | 164.605 |
| 0.6840277777777778 | 164.605 |
| 0.6847222222222222 | 164.605 |
| 0.6854166666666667 | 164.605 |
| 0.686111111111111 | 164.605 |
| 0.6868055555555556 | 164.605 |
| 0.6875 | 169.156 |
| 0.6881944444444444 | 164.605 |
| 0.688888888888889 | 169.156 |
| 0.6895833333333333 | 169.156 |
| 0.6902777777777778 | 164.605 |
| 0.6909722222222222 | 160.056 |
| 0.6916666666666668 | 155.509 |
| 0.6923611111111111 | 155.509 |
| 0.6930555555555555 | 155.509 |
| 0.69375 | 150.964 |
| 0.6944444444444445 | 146.423 |
| 0.6951388888888889 | 146.423 |
| 0.6958333333333333 | 146.423 |
| 0.6965277777777777 | 146.423 |
| 0.6972222222222223 | 141.884 |
| 0.6979166666666666 | 137.347 |
| 0.6986111111111111 | 137.347 |
| 0.6993055555555556 | 137.347 |
| 0.7000000000000001 | 128.284 |
| 0.7006944444444444 | 128.284 |
| 0.7013888888888888 | 123.758 |
| 0.7020833333333334 | 128.284 |
| 0.7027777777777778 | 128.284 |
| 0.7034722222222222 | 132.814 |
| 0.7041666666666666 | 132.814 |
| 0.7048611111111112 | 128.284 |
| 0.7055555555555556 | 128.284 |
| 0.7062499999999999 | 128.284 |
| 0.7069444444444444 | 128.284 |
| 0.7076388888888889 | 128.284 |
| 0.7083333333333334 | 128.284 |
| 0.7090277777777777 | 128.284 |
| 0.7097222222222223 | 123.758 |
| 0.7104166666666667 | 123.758 |
| 0.7111111111111111 | 119.235 |
| 0.7118055555555555 | 119.235 |
| 0.7125 | 119.235 |
| 0.7131944444444445 | 114.716 |
| 0.7138888888888889 | 114.716 |
| 0.7145833333333332 | 110.201 |
| 0.7152777777777778 | 114.716 |
| 0.7159722222222222 | 114.716 |
| 0.7166666666666667 | 114.716 |
| 0.717361111111111 | 114.716 |
| 0.7180555555555556 | 114.716 |
| 0.71875 | 114.716 |
| 0.7194444444444444 | 114.716 |
| 0.720138888888889 | 114.716 |
| 0.7208333333333333 | 110.201 |
| 0.7215277777777778 | 110.201 |
| 0.7222222222222222 | 110.201 |
| 0.7229166666666668 | 110.201 |
| 0.7236111111111111 | 110.201 |
| 0.7243055555555555 | 110.201 |
| 0.725 | 110.201 |
| 0.7256944444444445 | 110.201 |
| 0.7263888888888889 | 105.69 |
| 0.7270833333333333 | 105.69 |
| 0.7277777777777777 | 105.69 |
| 0.7284722222222223 | 105.69 |
| 0.7291666666666666 | 105.69 |
| 0.7298611111111111 | 105.69 |
| 0.7305555555555556 | 105.69 |
| 0.7312500000000001 | 101.184 |
| 0.7319444444444444 | 101.184 |
| 0.7326388888888888 | 101.184 |
| 0.7333333333333334 | 101.184 |
| 0.7340277777777778 | 96.682 |
| 0.7347222222222222 | 96.682 |
| 0.7354166666666666 | 96.682 |
| 0.7361111111111112 | 101.184 |
| 0.7368055555555556 | 101.184 |
| 0.7374999999999999 | 101.184 |
| 0.7381944444444444 | 101.184 |
| 0.7388888888888889 | 101.184 |
| 0.7395833333333334 | 101.184 |
| 0.7402777777777777 | 101.184 |
| 0.7409722222222223 | 101.184 |
| 0.7416666666666667 | 101.184 |
| 0.7423611111111111 | 96.682 |
| 0.7430555555555555 | 92.184 |
| 0.74375 | 92.184 |
| 0.7444444444444445 | 92.184 |
| 0.7451388888888889 | 92.184 |
| 0.7458333333333332 | 92.184 |
| 0.7465277777777778 | 92.184 |
| 0.7472222222222222 | 92.184 |
| 0.7479166666666667 | 92.184 |
| 0.748611111111111 | 92.184 |
| 0.7493055555555556 | 92.184 |
| 0.75 | 87.692 |
| 0.7506944444444444 | 87.692 |
| 0.751388888888889 | 83.205 |
| 0.7520833333333333 | 83.205 |
| 0.7527777777777778 | 83.205 |
| 0.7534722222222222 | 83.205 |
| 0.7541666666666668 | 83.205 |
| 0.7548611111111111 | 83.205 |
| 0.7555555555555555 | 83.205 |
| 0.75625 | 83.205 |
| 0.7569444444444445 | 83.205 |
| 0.7576388888888889 | 78.722 |
| 0.7583333333333333 | 78.722 |
| 0.7590277777777777 | 78.722 |
| 0.7597222222222223 | 78.722 |
| 0.7604166666666666 | 74.246 |
| 0.7611111111111111 | 74.246 |
| 0.7618055555555556 | 74.246 |
| 0.7625000000000001 | 74.246 |
| 0.7631944444444444 | 74.246 |
| 0.7638888888888888 | 74.246 |
| 0.7645833333333334 | 69.775 |
| 0.7652777777777778 | 69.775 |
| 0.7659722222222222 | 69.775 |
| 0.7666666666666666 | 69.775 |
| 0.7673611111111112 | 69.775 |
| 0.7680555555555556 | 69.775 |
| 0.7687499999999999 | 69.775 |
| 0.7694444444444444 | 65.31 |
| 0.7701388888888889 | 65.31 |
| 0.7708333333333334 | 65.31 |
| 0.7715277777777777 | 65.31 |
| 0.7722222222222223 | 65.31 |
| 0.7729166666666667 | 60.85 |
| 0.7736111111111111 | 60.85 |
| 0.7743055555555555 | 60.85 |
| 0.775 | 60.85 |
| 0.7756944444444445 | 60.85 |
| 0.7763888888888889 | 56.398 |
| 0.7770833333333332 | 56.398 |
| 0.7777777777777778 | 56.398 |
| 0.7784722222222222 | 56.398 |
| 0.7791666666666667 | 56.398 |
| 0.779861111111111 | 56.398 |
| 0.7805555555555556 | 56.398 |
| 0.78125 | 51.951 |
| 0.7819444444444444 | 51.951 |
| 0.782638888888889 | 51.951 |
| 0.7833333333333333 | 51.951 |
| 0.7840277777777778 | 51.951 |
| 0.7847222222222222 | 51.951 |
| 0.7854166666666668 | 47.511 |
| 0.7861111111111111 | 47.511 |
| 0.7868055555555555 | 47.511 |
| 0.7875 | 47.511 |
| 0.7881944444444445 | 47.511 |
| 0.7888888888888889 | 47.511 |
| 0.7895833333333333 | 47.511 |
| 0.7902777777777777 | 43.079 |
| 0.7909722222222223 | 43.079 |
| 0.7916666666666666 | 43.079 |
| 0.7923611111111111 | 43.079 |
| 0.7930555555555556 | 43.079 |
| 0.7937500000000001 | 43.079 |
| 0.7944444444444444 | 43.079 |
| 0.7951388888888888 | 38.653 |
| 0.7958333333333334 | 38.653 |
| 0.7965277777777778 | 38.653 |
| 0.7972222222222222 | 38.653 |
| 0.7979166666666666 | 38.653 |
| 0.7986111111111112 | 38.653 |
| 0.7993055555555556 | 38.653 |
| 0.7999999999999999 | 38.653 |
| 0.8006944444444444 | 34.234 |
| 0.8013888888888889 | 34.234 |
| 0.8020833333333334 | 34.234 |
| 0.8027777777777777 | 34.234 |
| 0.8034722222222223 | 34.234 |
| 0.8041666666666667 | 34.234 |
| 0.8048611111111111 | 34.234 |
| 0.8055555555555555 | 29.823 |
| 0.80625 | 29.823 |
| 0.8069444444444445 | 29.823 |
| 0.8076388888888889 | 29.823 |
| 0.8083333333333332 | 29.823 |
| 0.8090277777777778 | 29.823 |
| 0.8097222222222222 | 29.823 |
| 0.8104166666666667 | 25.419 |
| 0.811111111111111 | 25.419 |
| 0.8118055555555556 | 25.419 |
| 0.8125 | 25.419 |
| 0.8131944444444444 | 25.419 |
| 0.813888888888889 | 25.419 |
| 0.8145833333333333 | 25.419 |
| 0.8152777777777778 | 25.419 |
| 0.8159722222222222 | 21.024 |
| 0.8166666666666668 | 21.024 |
| 0.8173611111111111 | 21.024 |
| 0.8180555555555555 | 21.024 |
| 0.81875 | 21.024 |
| 0.8194444444444445 | 16.636 |
| 0.8201388888888889 | 16.636 |
| 0.8208333333333333 | 16.636 |
| 0.8215277777777777 | 16.636 |
| 0.8222222222222223 | 16.636 |
| 0.8229166666666666 | 12.257 |
| 0.8236111111111111 | 12.257 |
| 0.8243055555555556 | 12.257 |
| 0.8250000000000001 | 12.257 |
| 0.8256944444444444 | 12.257 |
| 0.8263888888888888 | 12.257 |
| 0.8270833333333334 | 12.257 |
| 0.8277777777777778 | 12.257 |
| 0.8284722222222222 | 7.887 |
| 0.8291666666666666 | 12.257 |
| 0.8298611111111112 | 7.887 |
| 0.8305555555555556 | 7.887 |
| 0.8312499999999999 | 7.887 |
| 0.8319444444444444 | 7.887 |
| 0.8326388888888889 | 7.887 |
| 0.8333333333333334 | 3.525 |
| 0.8340277777777777 | 3.525 |
| 0.8347222222222223 | 3.525 |
| 0.8354166666666667 | 3.525 |
| 0.8361111111111111 | 3.525 |
| 0.8368055555555555 | 3.525 |
| 0.8375 | 3.525 |
| 0.8381944444444445 | 3.525 |
| 0.8388888888888889 | 3.525 |
| 0.8395833333333332 | 3.525 |
| 0.8402777777777778 | 0 |
| 0.8409722222222222 | 0 |
| 0.8416666666666667 | 0 |
| 0.842361111111111 | 0 |
| 0.8430555555555556 | 0 |
| 0.84375 | 0 |
| 0.8444444444444444 | 0 |
| 0.845138888888889 | 0 |
| 0.8458333333333333 | 0 |
| 0.8465277777777778 | 0 |
| 0.8472222222222222 | 0 |
| 0.8479166666666668 | 0 |
| 0.8486111111111111 | 0 |
| 0.8493055555555555 | 0 |
| 0.85 | 0 |
| 0.8506944444444445 | 0 |
| 0.8513888888888889 | 0 |
| 0.8520833333333333 | 0 |
| 0.8527777777777777 | 0 |
| 0.8534722222222223 | 0 |
| 0.8541666666666666 | 0 |
| 0.8548611111111111 | 0 |
| 0.8555555555555556 | 0 |
| 0.8562500000000001 | 0 |
| 0.8569444444444444 | 0 |
| 0.8576388888888888 | 0 |
| 0.8583333333333334 | 0 |
| 0.8590277777777778 | 0 |
| 0.8597222222222222 | 0 |
| 0.8604166666666666 | 0 |
| 0.8611111111111112 | 0 |
| 0.8618055555555556 | 0 |
| 0.8624999999999999 | 0 |
| 0.8631944444444444 | 0 |
| 0.8638888888888889 | 0 |
| 0.8645833333333334 | 0 |
| 0.8652777777777777 | 0 |
| 0.8659722222222223 | 0 |
| 0.8666666666666667 | 0 |
| 0.8673611111111111 | 0 |
| 0.8680555555555555 | 0 |
| 0.86875 | 0 |
| 0.8694444444444445 | 0 |
| 0.8701388888888889 | 0 |
| 0.8708333333333332 | 0 |
| 0.8715277777777778 | 0 |
| 0.8722222222222222 | 0 |
| 0.8729166666666667 | 0 |
| 0.873611111111111 | 0 |
| 0.8743055555555556 | 0 |
| 0.875 | 0 |
| 0.8756944444444444 | 0 |
| 0.876388888888889 | 0 |
| 0.8770833333333333 | 0 |
| 0.8777777777777778 | 0 |
| 0.8784722222222222 | 0 |
| 0.8791666666666668 | 0 |
| 0.8798611111111111 | 0 |
| 0.8805555555555555 | 0 |
| 0.88125 | 0 |
| 0.8819444444444445 | 0 |
| 0.8826388888888889 | 0 |
| 0.8833333333333333 | 0 |
| 0.8840277777777777 | 0 |
| 0.8847222222222223 | 0 |
| 0.8854166666666666 | 0 |
| 0.8861111111111111 | 0 |
| 0.8868055555555556 | 0 |
| 0.8875000000000001 | 0 |
| 0.8881944444444444 | 0 |
| 0.8888888888888888 | 0 |
| 0.8895833333333334 | 0 |
| 0.8902777777777778 | 0 |
| 0.8909722222222222 | 0 |
| 0.8916666666666666 | 0 |
| 0.8923611111111112 | 0 |
| 0.8930555555555556 | 0 |
| 0.8937499999999999 | 0 |
| 0.8944444444444444 | 0 |
| 0.8951388888888889 | 0 |
| 0.8958333333333334 | 0 |
| 0.8965277777777777 | 0 |
| 0.8972222222222223 | 0 |
| 0.8979166666666667 | 0 |
| 0.8986111111111111 | 0 |
| 0.8993055555555555 | 0 |
| 0.9 | 0 |
| 0.9006944444444445 | 0 |
| 0.9013888888888889 | 0 |
| 0.9020833333333332 | 0 |
| 0.9027777777777778 | 0 |
| 0.9034722222222222 | 0 |
| 0.9041666666666667 | 0 |
| 0.904861111111111 | 0 |
| 0.9055555555555556 | 0 |
| 0.90625 | 0 |
| 0.9069444444444444 | 0 |
| 0.907638888888889 | 0 |
| 0.9083333333333333 | 0 |
| 0.9090277777777778 | 0 |
| 0.9097222222222222 | 0 |
| 0.9104166666666668 | 0 |
| 0.9111111111111111 | 0 |
| 0.9118055555555555 | 0 |
| 0.9125 | 0 |
| 0.9131944444444445 | 0 |
| 0.9138888888888889 | 0 |
| 0.9145833333333333 | 0 |
| 0.9152777777777777 | 0 |
| 0.9159722222222223 | 0 |
| 0.9166666666666666 | 0 |
| 0.9173611111111111 | 0 |
| 0.9180555555555556 | 0 |
| 0.9187500000000001 | 0 |
| 0.9194444444444444 | 0 |
| 0.9201388888888888 | 0 |
| 0.9208333333333334 | 0 |
| 0.9215277777777778 | 0 |
| 0.9222222222222222 | 0 |
| 0.9229166666666666 | 0 |
| 0.9236111111111112 | 0 |
| 0.9243055555555556 | 0 |
| 0.9249999999999999 | 0 |
| 0.9256944444444444 | 0 |
| 0.9263888888888889 | 0 |
| 0.9270833333333334 | 0 |
| 0.9277777777777777 | 0 |
| 0.9284722222222223 | 0 |
| 0.9291666666666667 | 0 |
| 0.9298611111111111 | 0 |
| 0.9305555555555555 | 0 |
| 0.93125 | 0 |
| 0.9319444444444445 | 0 |
| 0.9326388888888889 | 0 |
| 0.9333333333333332 | 0 |
| 0.9340277777777778 | 0 |
| 0.9347222222222222 | 0 |
| 0.9354166666666667 | 0 |
| 0.936111111111111 | 0 |
| 0.9368055555555556 | 0 |
| 0.9375 | 0 |
| 0.9381944444444444 | 0 |
| 0.938888888888889 | 0 |
| 0.9395833333333333 | 0 |
| 0.9402777777777778 | 0 |
| 0.9409722222222222 | 0 |
| 0.9416666666666668 | 0 |
| 0.9423611111111111 | 0 |
| 0.9430555555555555 | 0 |
| 0.94375 | 0 |
| 0.9444444444444445 | 0 |
| 0.9451388888888889 | 0 |
| 0.9458333333333333 | 0 |
| 0.9465277777777777 | 0 |
| 0.9472222222222223 | 0 |
| 0.9479166666666666 | 0 |
| 0.9486111111111111 | 0 |
| 0.9493055555555556 | 0 |
| 0.9500000000000001 | 0 |
| 0.9506944444444444 | 0 |
| 0.9513888888888888 | 0 |
| 0.9520833333333334 | 0 |
| 0.9527777777777778 | 0 |
| 0.9534722222222222 | 0 |
| 0.9541666666666666 | 0 |
| 0.9548611111111112 | 0 |
| 0.9555555555555556 | 0 |
| 0.9562499999999999 | 0 |
| 0.9569444444444444 | 0 |
| 0.9576388888888889 | 0 |
| 0.9583333333333334 | 0 |
| 0.9590277777777777 | 0 |
| 0.9597222222222223 | 0 |
| 0.9604166666666667 | 0 |
| 0.9611111111111111 | 0 |
| 0.9618055555555555 | 0 |
| 0.9625 | 0 |
| 0.9631944444444445 | 0 |
| 0.9638888888888889 | 0 |
| 0.9645833333333332 | 0 |
| 0.9652777777777778 | 0 |
| 0.9659722222222222 | 0 |
| 0.9666666666666667 | 0 |
| 0.967361111111111 | 0 |
| 0.9680555555555556 | 0 |
| 0.96875 | 0 |
| 0.9694444444444444 | 0 |
| 0.970138888888889 | 0 |
| 0.9708333333333333 | 0 |
| 0.9715277777777778 | 0 |
| 0.9722222222222222 | 0 |
| 0.9729166666666668 | 0 |
| 0.9736111111111111 | 0 |
| 0.9743055555555555 | 0 |
| 0.975 | 0 |
| 0.9756944444444445 | 0 |
| 0.9763888888888889 | 0 |
| 0.9770833333333333 | 0 |
| 0.9777777777777777 | 0 |
| 0.9784722222222223 | 0 |
| 0.9791666666666666 | 0 |
| 0.9798611111111111 | 0 |
| 0.9805555555555556 | 0 |
| 0.9812500000000001 | 0 |
| 0.9819444444444444 | 0 |
| 0.9826388888888888 | 0 |
| 0.9833333333333334 | 0 |
| 0.9840277777777778 | 0 |
| 0.9847222222222222 | 0 |
| 0.9854166666666666 | 0 |
| 0.9861111111111112 | 0 |
| 0.9868055555555556 | 0 |
| 0.9874999999999999 | 0 |
| 0.9881944444444444 | 0 |
| 0.9888888888888889 | 0 |
| 0.9895833333333334 | 0 |
| 0.9902777777777777 | 0 |
| 0.9909722222222223 | 0 |
| 0.9916666666666667 | 0 |
| 0.9923611111111111 | 0 |
| 0.9930555555555555 | 0 |
| 0.99375 | 0 |
| 0.9944444444444445 | 0 |
| 0.9951388888888889 | 0 |
| 0.9958333333333332 | 0 |
| 0.9965277777777778 | 0 |
| 0.9972222222222222 | 0 |
| 0.9979166666666667 | 0 |
| 0.998611111111111 | 0 |
| 0.9993055555555556 | 0 |